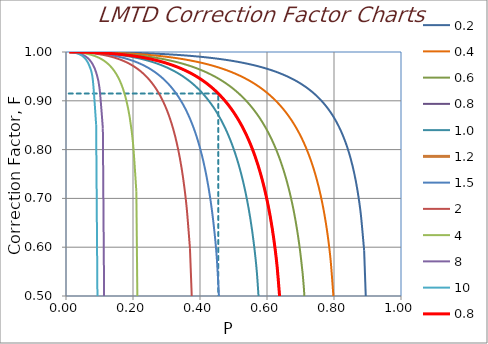
| Category | Series 12 |
|---|---|
| 0.45454545454545453 | 0 |
| 0.45454545454545453 | 0.915 |
| 0.0 | 0.915 |